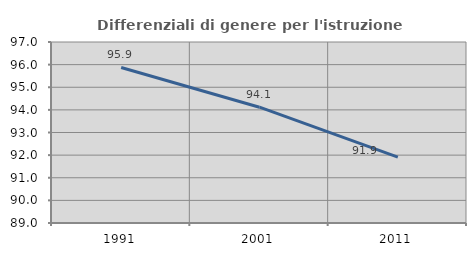
| Category | Differenziali di genere per l'istruzione superiore |
|---|---|
| 1991.0 | 95.875 |
| 2001.0 | 94.118 |
| 2011.0 | 91.908 |